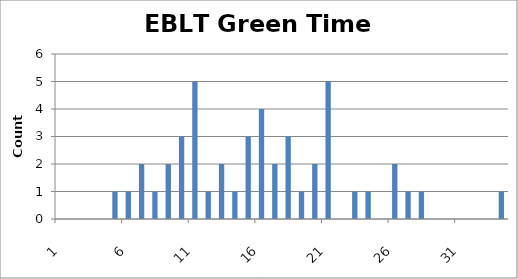
| Category | Series 0 |
|---|---|
| 0 | 0 |
| 1 | 0 |
| 2 | 0 |
| 3 | 0 |
| 4 | 1 |
| 5 | 1 |
| 6 | 2 |
| 7 | 1 |
| 8 | 2 |
| 9 | 3 |
| 10 | 5 |
| 11 | 1 |
| 12 | 2 |
| 13 | 1 |
| 14 | 3 |
| 15 | 4 |
| 16 | 2 |
| 17 | 3 |
| 18 | 1 |
| 19 | 2 |
| 20 | 5 |
| 21 | 0 |
| 22 | 1 |
| 23 | 1 |
| 24 | 0 |
| 25 | 2 |
| 26 | 1 |
| 27 | 1 |
| 28 | 0 |
| 29 | 0 |
| 30 | 0 |
| 31 | 0 |
| 32 | 0 |
| 33 | 1 |